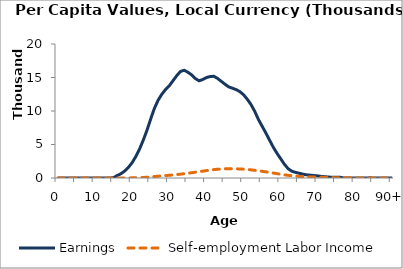
| Category | Earnings | Self-employment Labor Income |
|---|---|---|
| 0 | 0 | 0 |
|  | 0 | 0 |
| 2 | 0 | 0 |
| 3 | 0 | 0 |
| 4 | 0 | 0 |
| 5 | 0 | 0 |
| 6 | 0 | 0 |
| 7 | 0 | 0 |
| 8 | 0 | 0 |
| 9 | 0 | 0 |
| 10 | 0 | 0 |
| 11 | 0 | 0 |
| 12 | 0 | 0 |
| 13 | 0 | 0 |
| 14 | 0 | 0 |
| 15 | 51.48 | 0 |
| 16 | 378.674 | 0 |
| 17 | 641.034 | 0 |
| 18 | 1048.418 | 0 |
| 19 | 1584.345 | 0 |
| 20 | 2293.106 | 28.754 |
| 21 | 3215.119 | 40.898 |
| 22 | 4318.093 | 56.83 |
| 23 | 5664.971 | 79.623 |
| 24 | 7127.653 | 112.05 |
| 25 | 8820.268 | 160.73 |
| 26 | 10405.703 | 216.913 |
| 27 | 11617.393 | 272.063 |
| 28 | 12508.506 | 322.011 |
| 29 | 13210.971 | 366.607 |
| 30 | 13763.082 | 408.19 |
| 31 | 14521.539 | 453.72 |
| 32 | 15272.669 | 505.607 |
| 33 | 15897.553 | 571.811 |
| 34 | 16076.053 | 641.826 |
| 35 | 15789.837 | 710.159 |
| 36 | 15398.327 | 783.882 |
| 37 | 14852.873 | 868.577 |
| 38 | 14507.452 | 944.805 |
| 39 | 14699.907 | 1022.558 |
| 40 | 14993.698 | 1103.114 |
| 41 | 15138.759 | 1182.322 |
| 42 | 15181.339 | 1251.607 |
| 43 | 14860.967 | 1303.911 |
| 44 | 14426.428 | 1342.254 |
| 45 | 13998.032 | 1372.001 |
| 46 | 13598.552 | 1385.593 |
| 47 | 13405.827 | 1382.802 |
| 48 | 13187.656 | 1372.676 |
| 49 | 12895.424 | 1351.27 |
| 50 | 12420.512 | 1316.253 |
| 51 | 11754.087 | 1276.14 |
| 52 | 10964.732 | 1214.227 |
| 53 | 9950.785 | 1149.316 |
| 54 | 8741.232 | 1075.126 |
| 55 | 7726.793 | 1001.632 |
| 56 | 6714.85 | 917.469 |
| 57 | 5645.651 | 825.797 |
| 58 | 4593.721 | 738.044 |
| 59 | 3685.632 | 648.232 |
| 60 | 2866.069 | 560.037 |
| 61 | 2049.92 | 472.326 |
| 62 | 1384.374 | 397.506 |
| 63 | 1010.523 | 333.854 |
| 64 | 833.465 | 283.032 |
| 65 | 705.848 | 237.485 |
| 66 | 572.057 | 204.443 |
| 67 | 469.526 | 176.542 |
| 68 | 417.757 | 154.44 |
| 69 | 371.774 | 142.122 |
| 70 | 310.456 | 124.704 |
| 71 | 230.562 | 100.174 |
| 72 | 184.253 | 86.349 |
| 73 | 137.268 | 68.898 |
| 74 | 104.659 | 59.041 |
| 75 | 97.564 | 50.162 |
| 76 | 102.803 | 40.295 |
| 77 | 8.022 | 31.602 |
| 78 | 8.015 | 24.906 |
| 79 | 0 | 19.905 |
| 80 | 0 | 15.87 |
| 81 | 0 | 12.328 |
| 82 | 0 | 9.624 |
| 83 | 0 | 7.361 |
| 84 | 28.592 | 5.035 |
| 85 | 0 | 2.7 |
| 86 | 0 | 0.387 |
| 87 | 0 | 0 |
| 88 | 0 | 0 |
| 89 | 0 | 0 |
| 90+ | 0 | 0 |